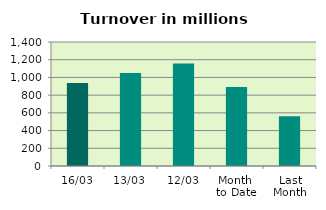
| Category | Series 0 |
|---|---|
| 16/03 | 935.984 |
| 13/03 | 1049.717 |
| 12/03 | 1156.505 |
| Month 
to Date | 892.458 |
| Last
Month | 561.452 |